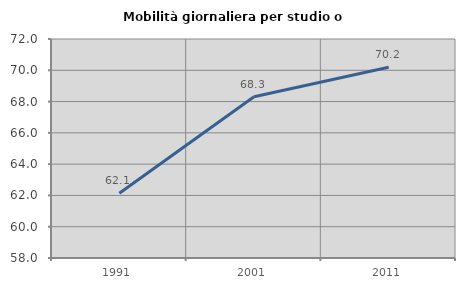
| Category | Mobilità giornaliera per studio o lavoro |
|---|---|
| 1991.0 | 62.143 |
| 2001.0 | 68.303 |
| 2011.0 | 70.189 |